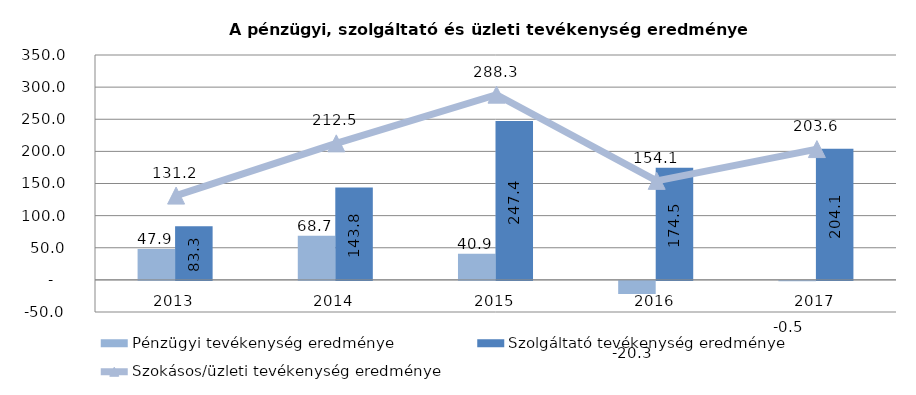
| Category | Pénzügyi tevékenység eredménye | Szolgáltató tevékenység eredménye |
|---|---|---|
| 2013.0 | 47.9 | 83.3 |
| 2014.0 | 68.7 | 143.8 |
| 2015.0 | 40.852 | 247.438 |
| 2016.0 | -20.3 | 174.5 |
| 2017.0 | -0.5 | 204.107 |